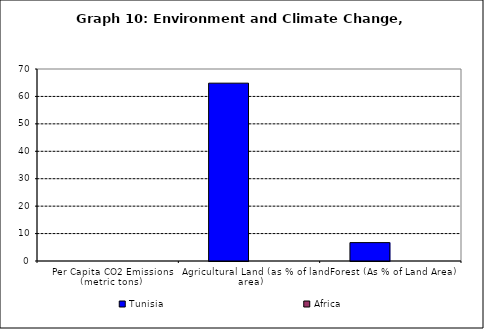
| Category | Tunisia | Africa |
|---|---|---|
| Per Capita CO2 Emissions (metric tons) | 0 | 0 |
| Agricultural Land (as % of land area) | 64.837 | 0 |
| Forest (As % of Land Area) | 6.701 | 0 |